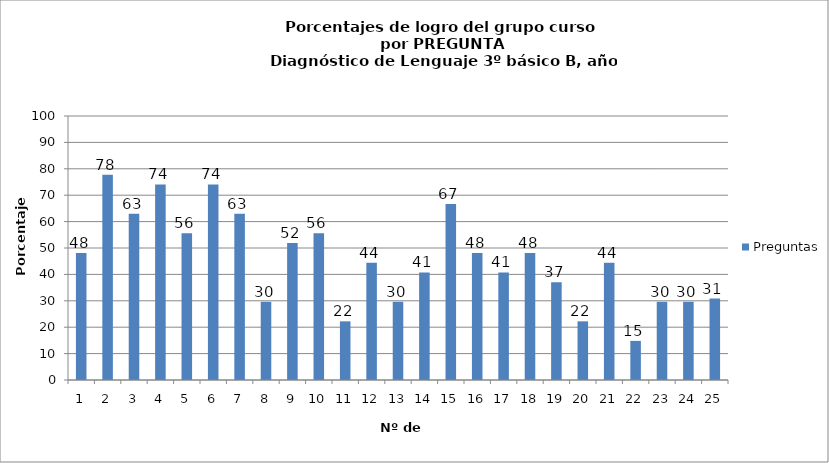
| Category | Preguntas |
|---|---|
| 0 | 48.148 |
| 1 | 77.778 |
| 2 | 62.963 |
| 3 | 74.074 |
| 4 | 55.556 |
| 5 | 74.074 |
| 6 | 62.963 |
| 7 | 29.63 |
| 8 | 51.852 |
| 9 | 55.556 |
| 10 | 22.222 |
| 11 | 44.444 |
| 12 | 29.63 |
| 13 | 40.741 |
| 14 | 66.667 |
| 15 | 48.148 |
| 16 | 40.741 |
| 17 | 48.148 |
| 18 | 37.037 |
| 19 | 22.222 |
| 20 | 44.444 |
| 21 | 14.815 |
| 22 | 29.63 |
| 23 | 29.63 |
| 24 | 30.864 |